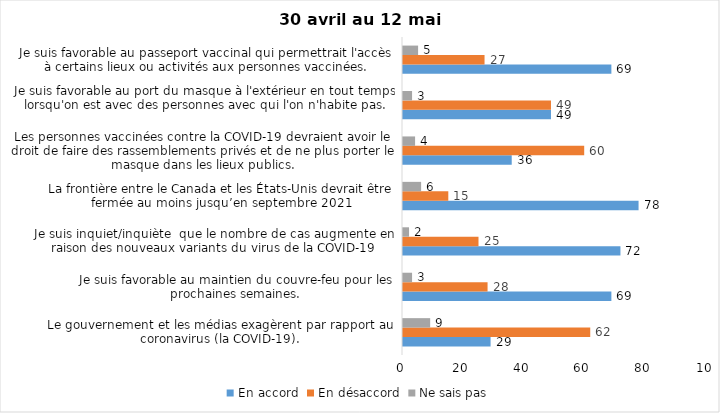
| Category | En accord | En désaccord | Ne sais pas |
|---|---|---|---|
| Le gouvernement et les médias exagèrent par rapport au coronavirus (la COVID-19). | 29 | 62 | 9 |
| Je suis favorable au maintien du couvre-feu pour les prochaines semaines. | 69 | 28 | 3 |
| Je suis inquiet/inquiète  que le nombre de cas augmente en raison des nouveaux variants du virus de la COVID-19 | 72 | 25 | 2 |
| La frontière entre le Canada et les États-Unis devrait être fermée au moins jusqu’en septembre 2021 | 78 | 15 | 6 |
| Les personnes vaccinées contre la COVID-19 devraient avoir le droit de faire des rassemblements privés et de ne plus porter le masque dans les lieux publics. | 36 | 60 | 4 |
| Je suis favorable au port du masque à l'extérieur en tout temps lorsqu'on est avec des personnes avec qui l'on n'habite pas. | 49 | 49 | 3 |
| Je suis favorable au passeport vaccinal qui permettrait l'accès à certains lieux ou activités aux personnes vaccinées. | 69 | 27 | 5 |